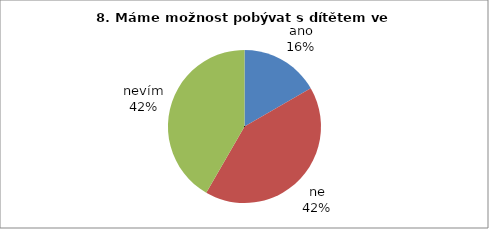
| Category | 8. Máme možnost pobývat s dítětem ve třídě. |
|---|---|
| ano | 6 |
| ne | 15 |
| nevím | 15 |